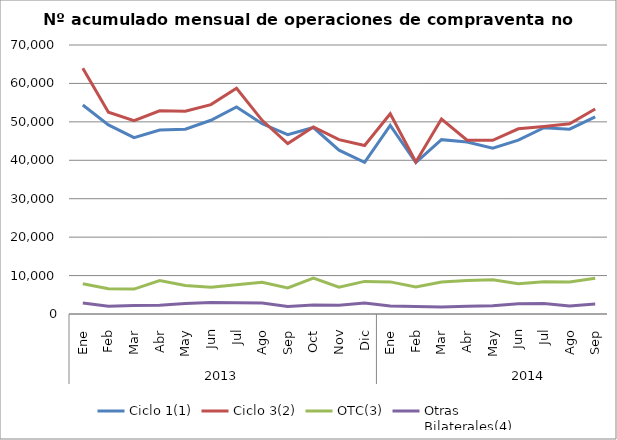
| Category | Ciclo 1(1) | Ciclo 3(2) | OTC(3) | Otras
Bilaterales(4) |
|---|---|---|---|---|
| 0 | 54386 | 63960 | 7873 | 2891 |
| 1 | 49196 | 52525 | 6550 | 2012 |
| 2 | 45892 | 50320 | 6475 | 2233 |
| 3 | 47876 | 52874 | 8686 | 2274 |
| 4 | 48091 | 52767 | 7394 | 2733 |
| 5 | 50415 | 54485 | 6994 | 3021 |
| 6 | 53879 | 58744 | 7586 | 2959 |
| 7 | 49504 | 50401 | 8243 | 2889 |
| 8 | 46688 | 44370 | 6784 | 1951 |
| 9 | 48531 | 48693 | 9357 | 2324 |
| 10 | 42642 | 45362 | 7000 | 2275 |
| 11 | 39447 | 43831 | 8487 | 2831 |
| 12 | 49087 | 52117 | 8357 | 2090 |
| 13 | 39397 | 39565 | 7045 | 1958 |
| 14 | 45373 | 50721 | 8313 | 1843 |
| 15 | 44744 | 45214 | 8739 | 2016 |
| 16 | 43118 | 45196 | 8896 | 2164 |
| 17 | 45225 | 48182 | 7881 | 2648 |
| 18 | 48478 | 48790 | 8413 | 2759 |
| 19 | 48087 | 49488 | 8324 | 2057 |
| 20 | 51316 | 53331 | 9278 | 2578 |